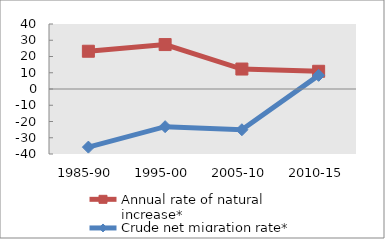
| Category | Annual rate of natural increase* | Crude net migration rate* |
|---|---|---|
| 1985-90 | 23.239 | -35.762 |
| 1995-00 | 27.343 | -23.177 |
| 2005-10 | 12.282 | -25.075 |
| 2010-15 | 10.902 | 8.386 |